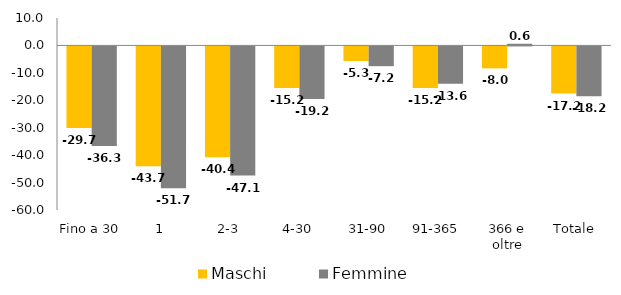
| Category | Maschi | Femmine |
|---|---|---|
| Fino a 30 | -29.7 | -36.3 |
| 1 | -43.7 | -51.7 |
| 2-3 | -40.4 | -47.1 |
| 4-30 | -15.2 | -19.2 |
| 31-90 | -5.3 | -7.2 |
| 91-365 | -15.2 | -13.6 |
| 366 e oltre | -8 | 0.6 |
|  Totale  | -17.2 | -18.2 |